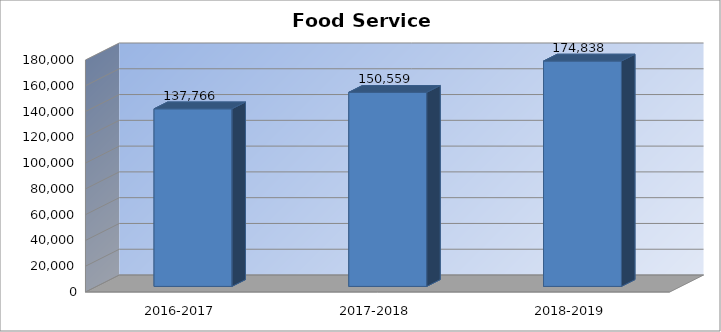
| Category | Food Service Expenditures |
|---|---|
| 2016-2017 | 137766 |
| 2017-2018 | 150559 |
| 2018-2019 | 174838 |